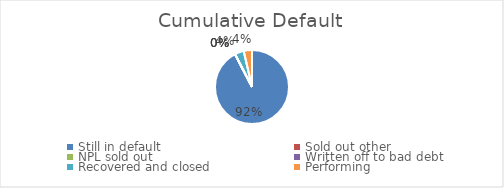
| Category | Series 0 |
|---|---|
| Still in default | 0.924 |
| Sold out other | 0 |
| NPL sold out | 0 |
| Written off to bad debt | 0 |
| Recovered and closed | 0.04 |
| Performing | 0.036 |